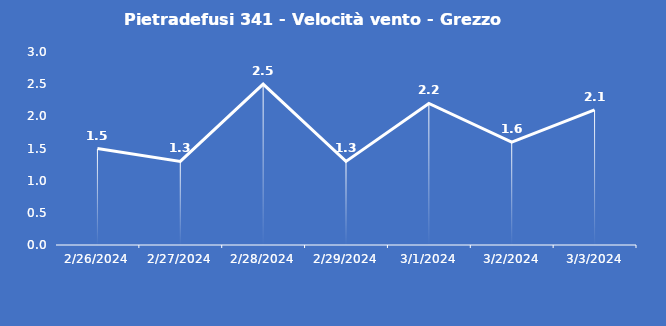
| Category | Pietradefusi 341 - Velocità vento - Grezzo (m/s) |
|---|---|
| 2/26/24 | 1.5 |
| 2/27/24 | 1.3 |
| 2/28/24 | 2.5 |
| 2/29/24 | 1.3 |
| 3/1/24 | 2.2 |
| 3/2/24 | 1.6 |
| 3/3/24 | 2.1 |